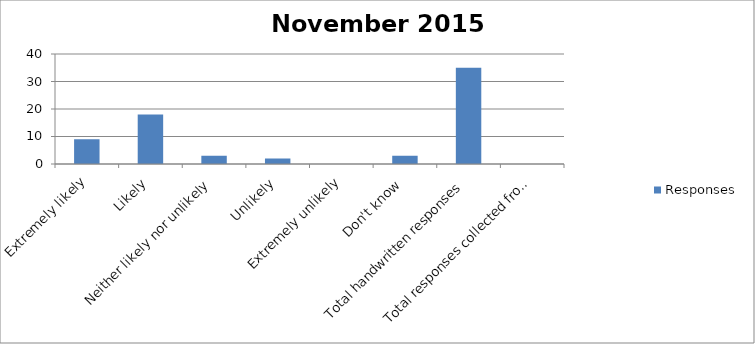
| Category | Responses |
|---|---|
| Extremely likely | 9 |
| Likely | 18 |
| Neither likely nor unlikely | 3 |
| Unlikely | 2 |
| Extremely unlikely | 0 |
| Don't know | 3 |
| Total handwritten responses | 35 |
| Total responses collected from other methods | 0 |